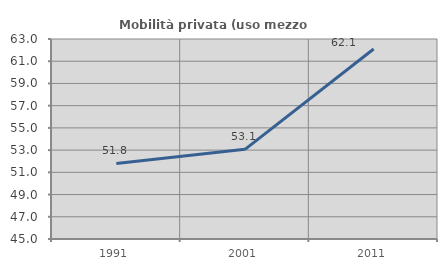
| Category | Mobilità privata (uso mezzo privato) |
|---|---|
| 1991.0 | 51.799 |
| 2001.0 | 53.069 |
| 2011.0 | 62.099 |